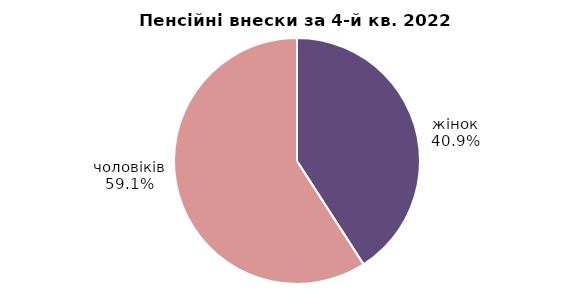
| Category | Series 0 |
|---|---|
| жінок | 38.194 |
| чоловіків | 55.215 |